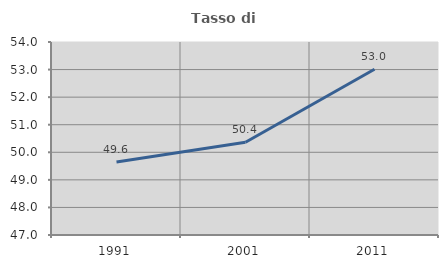
| Category | Tasso di occupazione   |
|---|---|
| 1991.0 | 49.649 |
| 2001.0 | 50.364 |
| 2011.0 | 53.012 |